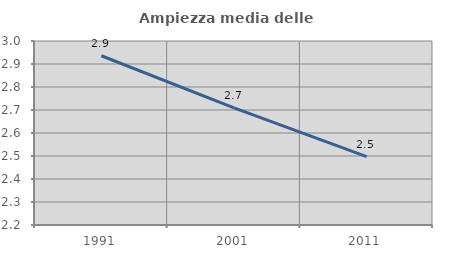
| Category | Ampiezza media delle famiglie |
|---|---|
| 1991.0 | 2.936 |
| 2001.0 | 2.709 |
| 2011.0 | 2.497 |